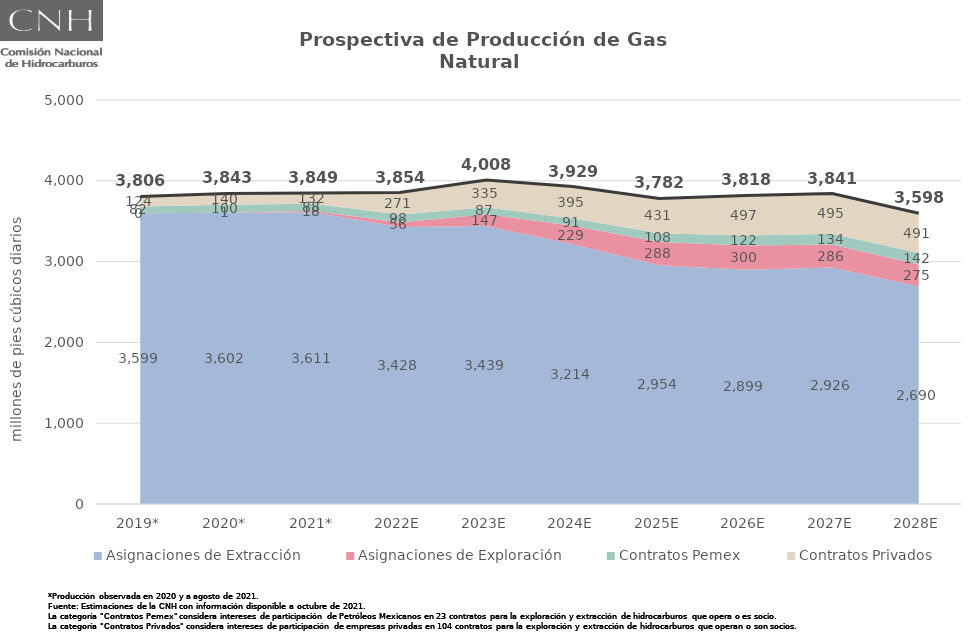
| Category | Total |
|---|---|
| 2019* | 3805.803 |
| 2020* | 3843.294 |
| 2021* | 3849.199 |
| 2022E | 3853.981 |
| 2023E | 4008.421 |
| 2024E | 3929.344 |
| 2025E | 3781.721 |
| 2026E | 3818.195 |
| 2027E | 3841.453 |
| 2028E | 3597.706 |